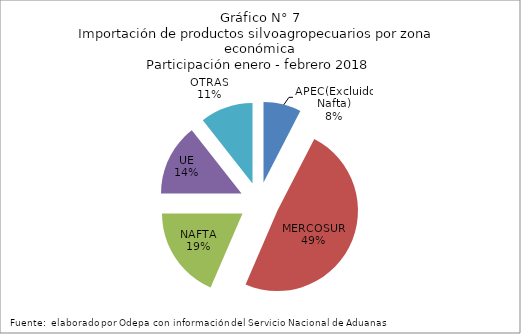
| Category | Series 0 |
|---|---|
| APEC(Excluido Nafta) | 74608.407 |
| MERCOSUR | 483325.807 |
| NAFTA | 183040.399 |
| UE | 142163.871 |
| OTRAS | 104568.515 |